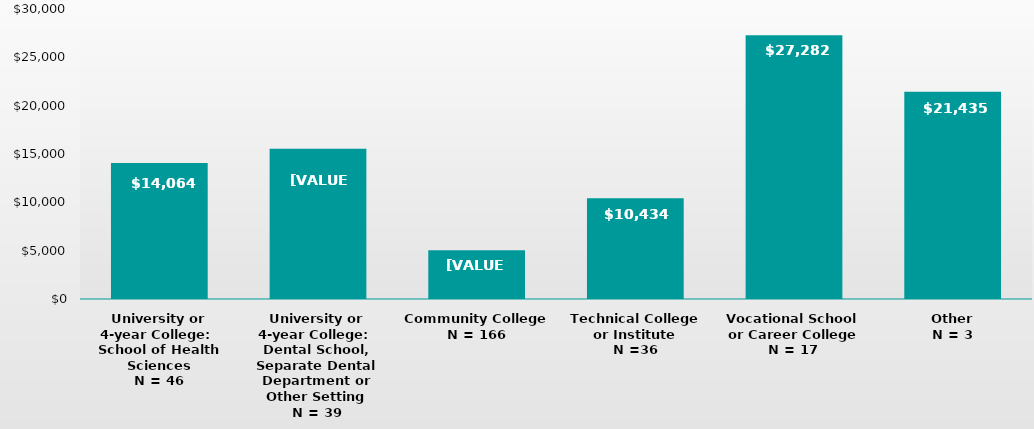
| Category | Series 0 |
|---|---|
| University or 4-year College: 
School of Health Sciences
N = 46 | 14064 |
| University or 4-year College: 
Dental School, Separate Dental Department or Other Setting
N = 39 | 15555 |
| Community College
N = 166 | 5048 |
| Technical College or Institute
N =36 | 10434 |
| Vocational School or Career College
N = 17 | 27282 |
| Other
N = 3 | 21435 |